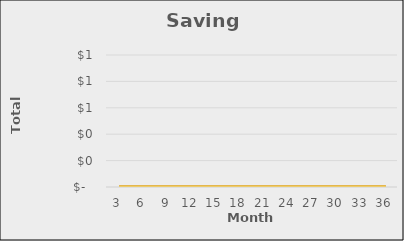
| Category | -10% | Savings | +10% |
|---|---|---|---|
| 0 | 0 | 0 | 0 |
| 1 | 0 | 0 | 0 |
| 2 | 0 | 0 | 0 |
| 3 | 0 | 0 | 0 |
| 4 | 0 | 0 | 0 |
| 5 | 0 | 0 | 0 |
| 6 | 0 | 0 | 0 |
| 7 | 0 | 0 | 0 |
| 8 | 0 | 0 | 0 |
| 9 | 0 | 0 | 0 |
| 10 | 0 | 0 | 0 |
| 11 | 0 | 0 | 0 |